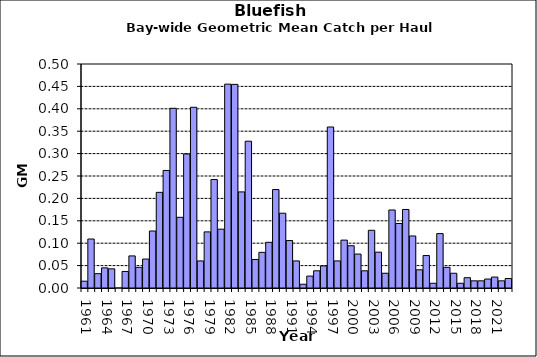
| Category | Series 0 |
|---|---|
| 1961.0 | 0.015 |
| 1962.0 | 0.109 |
| 1963.0 | 0.032 |
| 1964.0 | 0.045 |
| 1965.0 | 0.043 |
| 1966.0 | 0 |
| 1967.0 | 0.037 |
| 1968.0 | 0.072 |
| 1969.0 | 0.046 |
| 1970.0 | 0.065 |
| 1971.0 | 0.127 |
| 1972.0 | 0.213 |
| 1973.0 | 0.262 |
| 1974.0 | 0.401 |
| 1975.0 | 0.158 |
| 1976.0 | 0.299 |
| 1977.0 | 0.403 |
| 1978.0 | 0.06 |
| 1979.0 | 0.125 |
| 1980.0 | 0.242 |
| 1981.0 | 0.131 |
| 1982.0 | 0.455 |
| 1983.0 | 0.455 |
| 1984.0 | 0.214 |
| 1985.0 | 0.328 |
| 1986.0 | 0.064 |
| 1987.0 | 0.08 |
| 1988.0 | 0.102 |
| 1989.0 | 0.22 |
| 1990.0 | 0.167 |
| 1991.0 | 0.106 |
| 1992.0 | 0.06 |
| 1993.0 | 0.008 |
| 1994.0 | 0.027 |
| 1995.0 | 0.038 |
| 1996.0 | 0.049 |
| 1997.0 | 0.359 |
| 1998.0 | 0.06 |
| 1999.0 | 0.107 |
| 2000.0 | 0.094 |
| 2001.0 | 0.076 |
| 2002.0 | 0.038 |
| 2003.0 | 0.129 |
| 2004.0 | 0.08 |
| 2005.0 | 0.033 |
| 2006.0 | 0.174 |
| 2007.0 | 0.144 |
| 2008.0 | 0.175 |
| 2009.0 | 0.116 |
| 2010.0 | 0.041 |
| 2011.0 | 0.072 |
| 2012.0 | 0.011 |
| 2013.0 | 0.121 |
| 2014.0 | 0.046 |
| 2015.0 | 0.033 |
| 2016.0 | 0.011 |
| 2017.0 | 0.023 |
| 2018.0 | 0.016 |
| 2019.0 | 0.016 |
| 2020.0 | 0.02 |
| 2021.0 | 0.024 |
| 2022.0 | 0.016 |
| 2023.0 | 0.021 |